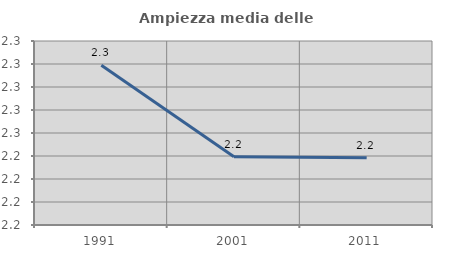
| Category | Ampiezza media delle famiglie |
|---|---|
| 1991.0 | 2.319 |
| 2001.0 | 2.239 |
| 2011.0 | 2.239 |